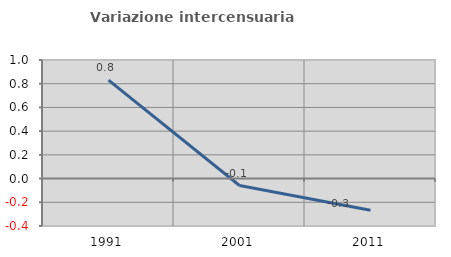
| Category | Variazione intercensuaria annua |
|---|---|
| 1991.0 | 0.83 |
| 2001.0 | -0.059 |
| 2011.0 | -0.266 |